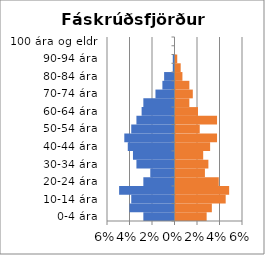
| Category | % karlar | %konur |
|---|---|---|
| 0-4 ára | -0.028 | 0.028 |
| 5-9 ára | -0.04 | 0.032 |
| 10-14 ára | -0.038 | 0.045 |
| 15-19 ára | -0.049 | 0.048 |
| 20-24 ára | -0.028 | 0.038 |
| 25-29 ára | -0.022 | 0.026 |
| 30-34 ára | -0.034 | 0.029 |
| 35-39 ára | -0.037 | 0.025 |
| 40-44 ára | -0.042 | 0.031 |
| 45-49 ára | -0.045 | 0.037 |
| 50-54 ára | -0.038 | 0.022 |
| 55-59 ára | -0.034 | 0.037 |
| 60-64 ára | -0.029 | 0.02 |
| 65-69 ára | -0.028 | 0.012 |
| 70-74 ára | -0.017 | 0.015 |
| 75-79 ára | -0.011 | 0.012 |
| 80-84 ára | -0.009 | 0.006 |
| 85-89 ára | -0.002 | 0.005 |
| 90-94 ára | -0.002 | 0.002 |
| 95-99 ára | 0 | 0 |
| 100 ára og eldri | 0 | 0 |